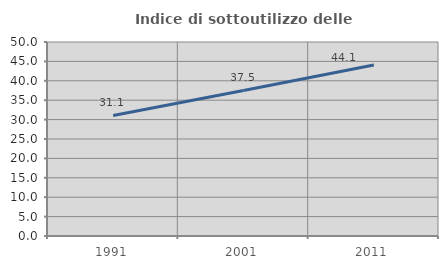
| Category | Indice di sottoutilizzo delle abitazioni  |
|---|---|
| 1991.0 | 31.064 |
| 2001.0 | 37.509 |
| 2011.0 | 44.092 |